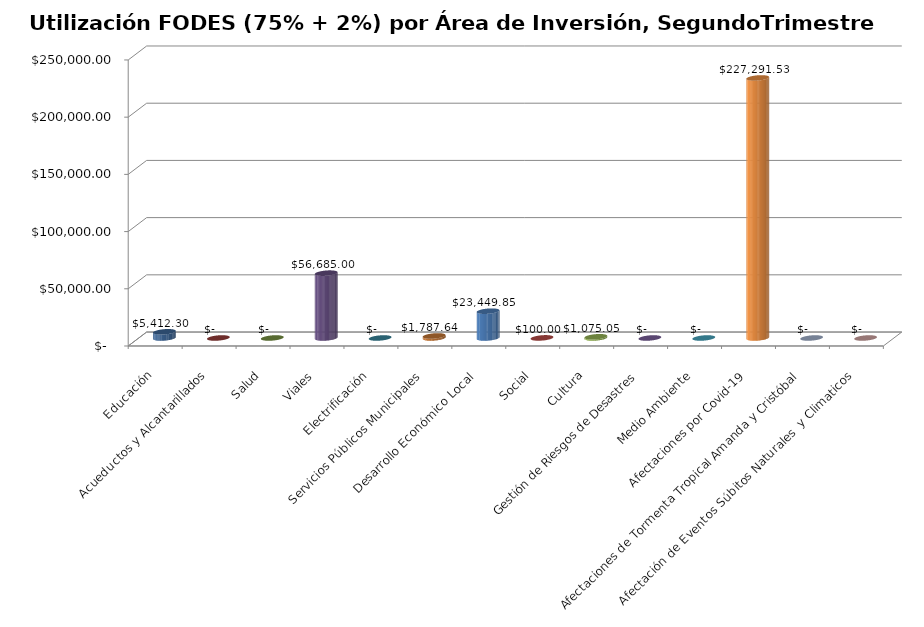
| Category | Series 0 |
|---|---|
| Educación | 5412.3 |
| Acueductos y Alcantarillados | 0 |
| Salud | 0 |
| Viales | 56685 |
| Electrificación | 0 |
| Servicios Públicos Municipales | 1787.64 |
| Desarrollo Económico Local | 23449.85 |
| Social | 100 |
| Cultura | 1075.05 |
| Gestión de Riesgos de Desastres | 0 |
| Medio Ambiente | 0 |
| Afectaciones por Covid-19 | 227291.53 |
| Afectaciones de Tormenta Tropical Amanda y Cristóbal | 0 |
| Afectación de Eventos Súbitos Naturales  y Climaticos | 0 |